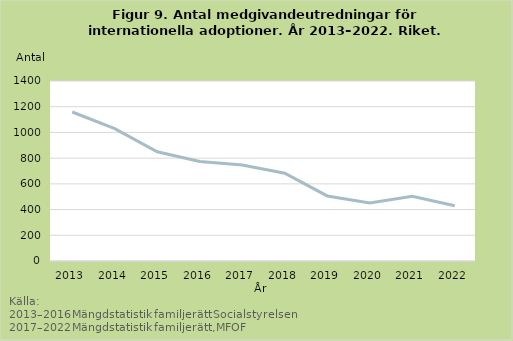
| Category | Medgivandeutredningar |
|---|---|
| 2013.0 | 1159 |
| 2014.0 | 1030 |
| 2015.0 | 850 |
| 2016.0 | 774 |
| 2017.0 | 747 |
| 2018.0 | 683 |
| 2019.0 | 506 |
| 2020.0 | 451 |
| 2021.0 | 504 |
| 2022.0 | 430 |